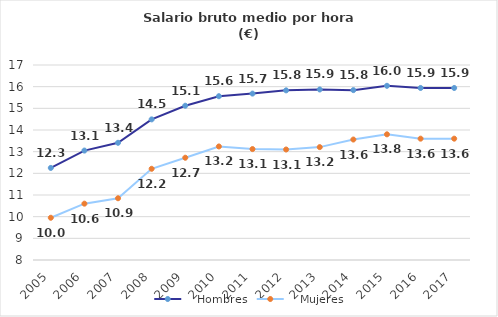
| Category |    Hombres |    Mujeres |
|---|---|---|
| 2005.0 | 12.25 | 9.95 |
| 2006.0 | 13.05 | 10.6 |
| 2007.0 | 13.41 | 10.85 |
| 2008.0 | 14.49 | 12.21 |
| 2009.0 | 15.12 | 12.72 |
| 2010.0 | 15.56 | 13.24 |
| 2011.0 | 15.68 | 13.12 |
| 2012.0 | 15.83 | 13.1 |
| 2013.0 | 15.87 | 13.21 |
| 2014.0 | 15.84 | 13.56 |
| 2015.0 | 16.04 | 13.8 |
| 2016.0 | 15.94 | 13.6 |
| 2017.0 | 15.94 | 13.6 |